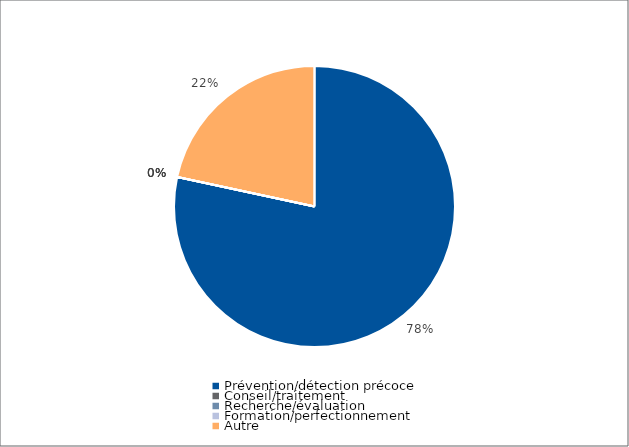
| Category | Series 0 |
|---|---|
| Prévention/détection précoce | 154223 |
| Conseil/traitement | 0 |
| Recherche/évaluation | 0 |
| Formation/perfectionnement | 0 |
| Autre | 42558.65 |